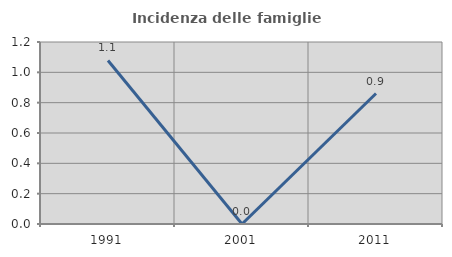
| Category | Incidenza delle famiglie numerose |
|---|---|
| 1991.0 | 1.078 |
| 2001.0 | 0 |
| 2011.0 | 0.86 |